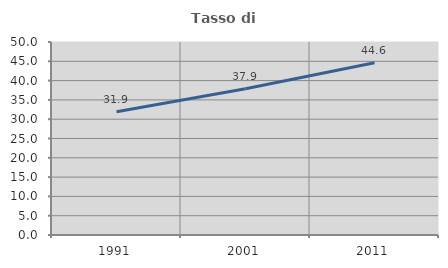
| Category | Tasso di occupazione   |
|---|---|
| 1991.0 | 31.936 |
| 2001.0 | 37.91 |
| 2011.0 | 44.64 |